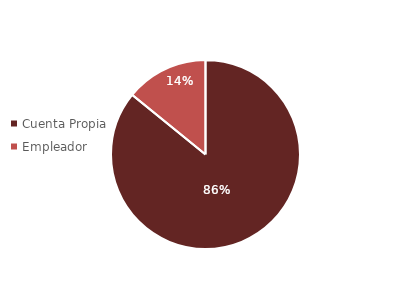
| Category | Total |
|---|---|
| Cuenta Propia | 308609.4 |
| Empleador | 50801.96 |